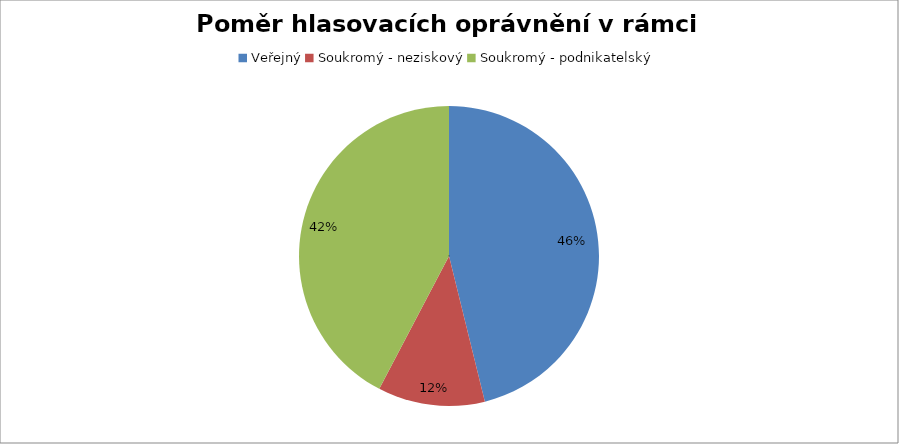
| Category | Series 0 |
|---|---|
| Veřejný | 0.462 |
| Soukromý - neziskový | 0.115 |
| Soukromý - podnikatelský | 0.423 |